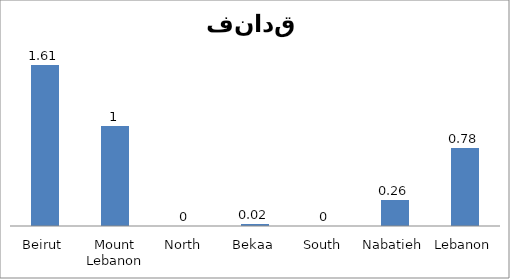
| Category | Series 0 |
|---|---|
| Beirut | 1.61 |
| Mount Lebanon | 1 |
| North | 0 |
| Bekaa | 0.02 |
| South | 0 |
| Nabatieh | 0.26 |
| Lebanon | 0.78 |